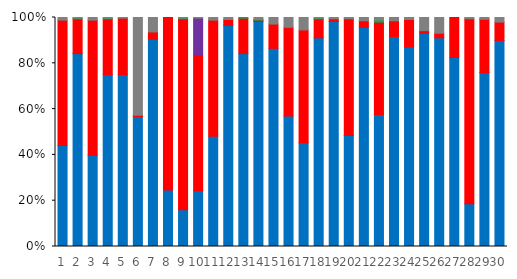
| Category | Series 0 | Series 1 | Series 2 | Series 3 |
|---|---|---|---|---|
| 0 | 154 | 191 | 0 | 4 |
| 1 | 294 | 53 | 1 | 1 |
| 2 | 139 | 206 | 0 | 4 |
| 3 | 262 | 85 | 1 | 1 |
| 4 | 262 | 86 | 0 | 1 |
| 5 | 198 | 2 | 0 | 149 |
| 6 | 316 | 11 | 0 | 22 |
| 7 | 86 | 263 | 0 | 0 |
| 8 | 56 | 291 | 1 | 1 |
| 9 | 85 | 207 | 56 | 1 |
| 10 | 168 | 177 | 0 | 4 |
| 11 | 337 | 9 | 0 | 3 |
| 12 | 294 | 54 | 1 | 0 |
| 13 | 343 | 2 | 1 | 3 |
| 14 | 302 | 37 | 0 | 10 |
| 15 | 199 | 135 | 0 | 15 |
| 16 | 158 | 172 | 0 | 19 |
| 17 | 318 | 29 | 1 | 1 |
| 18 | 343 | 4 | 0 | 2 |
| 19 | 169 | 178 | 0 | 2 |
| 20 | 334 | 10 | 0 | 5 |
| 21 | 201 | 141 | 3 | 4 |
| 22 | 320 | 24 | 0 | 5 |
| 23 | 304 | 42 | 0 | 3 |
| 24 | 325 | 4 | 0 | 20 |
| 25 | 318 | 7 | 0 | 24 |
| 26 | 288 | 61 | 0 | 0 |
| 27 | 65 | 282 | 0 | 2 |
| 28 | 265 | 81 | 1 | 2 |
| 29 | 314 | 28 | 0 | 7 |